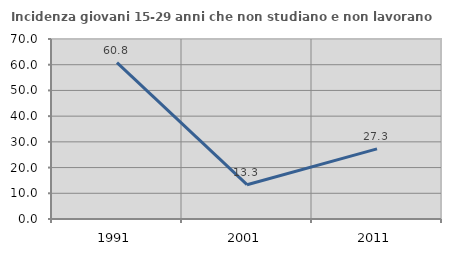
| Category | Incidenza giovani 15-29 anni che non studiano e non lavorano  |
|---|---|
| 1991.0 | 60.781 |
| 2001.0 | 13.333 |
| 2011.0 | 27.273 |